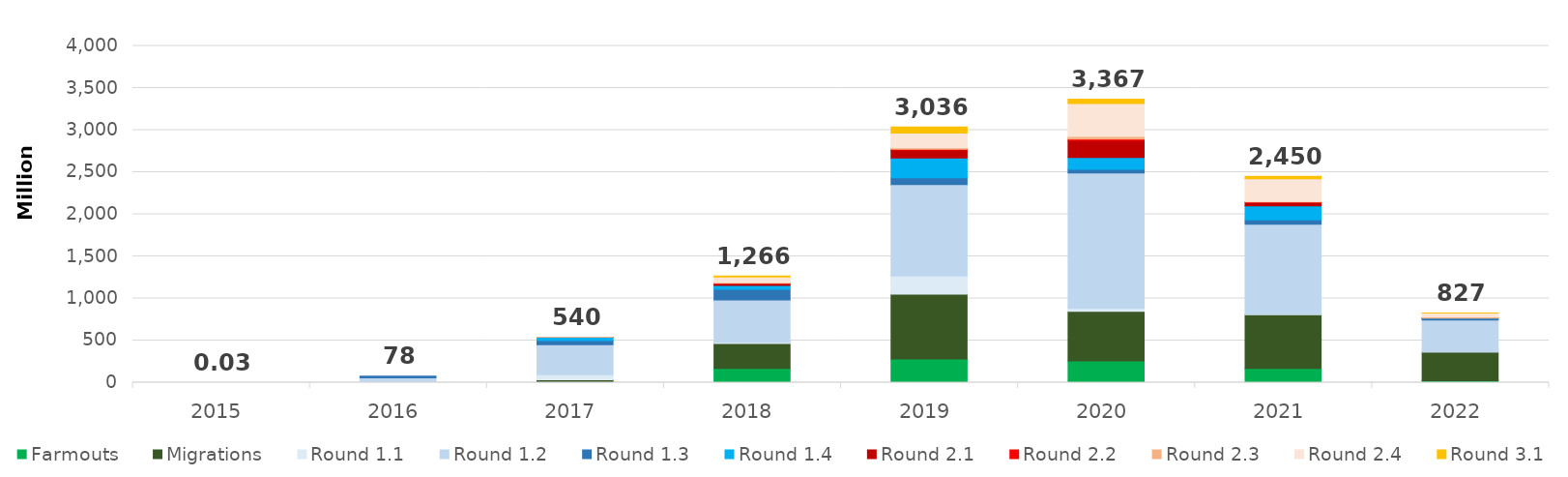
| Category | Farmouts | Migrations | Round 1.1 | Round 1.2 | Round 1.3 | Round 1.4 | Round 2.1 | Round 2.2 | Round 2.3 | Round 2.4 | Round 3.1 |
|---|---|---|---|---|---|---|---|---|---|---|---|
| 2015.0 | 0 | 0 | 0.023 | 0.003 | 0 | 0 | 0 | 0 | 0 | 0 | 0 |
| 2016.0 | 0 | 0 | 7.936 | 50.902 | 19.085 | 0 | 0 | 0 | 0 | 0 | 0 |
| 2017.0 | 1.551 | 32.93 | 60.276 | 356.292 | 49.062 | 38.707 | 0.93 | 0 | 0.096 | 0 | 0 |
| 2018.0 | 168.66 | 295.724 | 16.154 | 501.142 | 126.084 | 47.616 | 24.075 | 1.091 | 9.662 | 66.299 | 9.669 |
| 2019.0 | 280.617 | 772.208 | 213.486 | 1086.442 | 82.07 | 235.595 | 92.887 | 9.67 | 17.942 | 175.703 | 69.349 |
| 2020.0 | 258.021 | 590.016 | 33.998 | 1610.735 | 43.009 | 140.295 | 200.372 | 18.149 | 30.336 | 391.695 | 49.906 |
| 2021.0 | 169.637 | 638.47 | 8.662 | 1065.356 | 51.023 | 167.952 | 40.422 | 3.959 | 8.149 | 268.135 | 27.985 |
| 2022.0 | 21.717 | 341.963 | 0.096 | 380.942 | 14.35 | 8.487 | 0.005 | 0 | 12.94 | 46.691 | 0.001 |